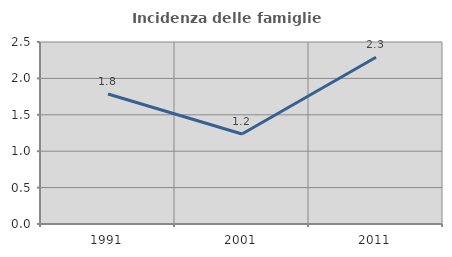
| Category | Incidenza delle famiglie numerose |
|---|---|
| 1991.0 | 1.786 |
| 2001.0 | 1.236 |
| 2011.0 | 2.291 |